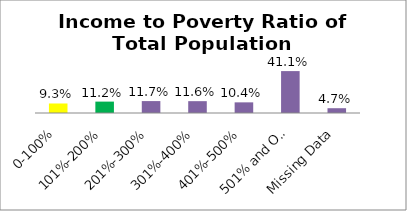
| Category | Percent |
|---|---|
| 0-100% | 0.093 |
| 101%-200% | 0.112 |
| 201%-300% | 0.117 |
| 301%-400% | 0.116 |
| 401%-500% | 0.104 |
| 501% and Over | 0.411 |
| Missing Data | 0.047 |